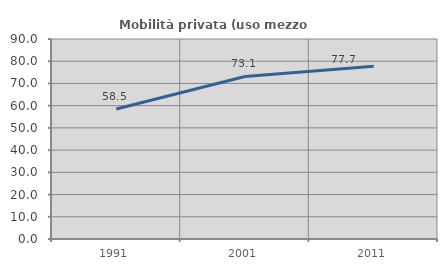
| Category | Mobilità privata (uso mezzo privato) |
|---|---|
| 1991.0 | 58.472 |
| 2001.0 | 73.136 |
| 2011.0 | 77.687 |